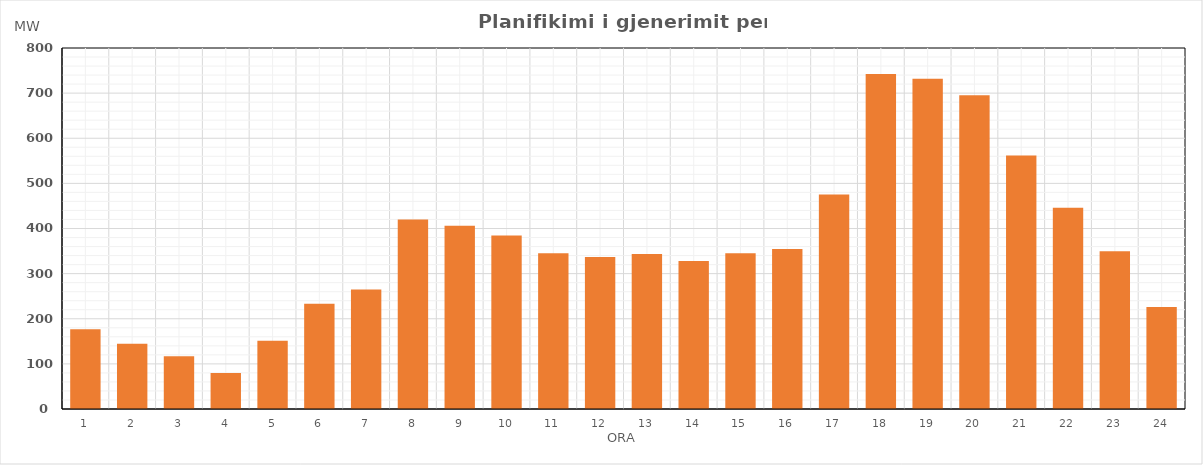
| Category | Max (MW) |
|---|---|
| 0 | 176.8 |
| 1 | 144.734 |
| 2 | 116.793 |
| 3 | 79.607 |
| 4 | 151.226 |
| 5 | 233.004 |
| 6 | 264.809 |
| 7 | 419.75 |
| 8 | 405.858 |
| 9 | 384.52 |
| 10 | 344.986 |
| 11 | 336.896 |
| 12 | 343.652 |
| 13 | 328.146 |
| 14 | 345.064 |
| 15 | 354.802 |
| 16 | 475.191 |
| 17 | 742.518 |
| 18 | 731.909 |
| 19 | 695.231 |
| 20 | 561.61 |
| 21 | 446.183 |
| 22 | 349.353 |
| 23 | 225.98 |